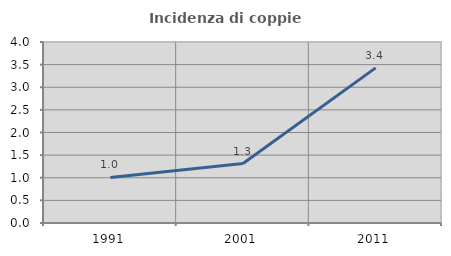
| Category | Incidenza di coppie miste |
|---|---|
| 1991.0 | 1.008 |
| 2001.0 | 1.314 |
| 2011.0 | 3.428 |